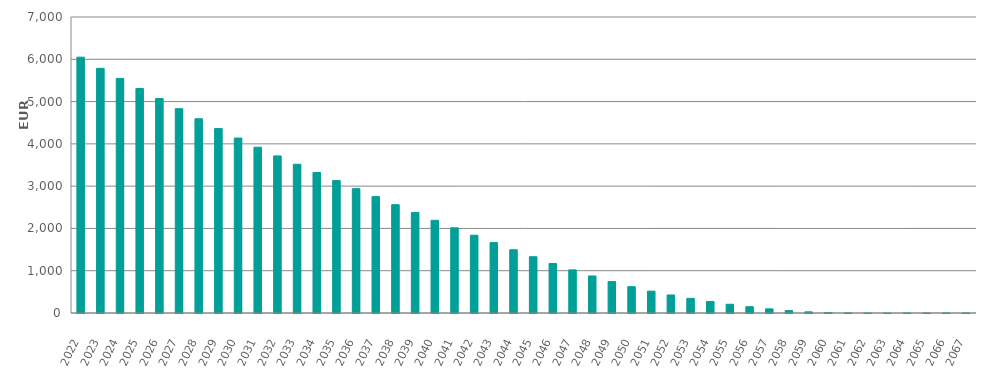
| Category | EUR Millions |
|---|---|
| 2022.0 | 6050000000.01 |
| 2023.0 | 5785903762.337 |
| 2024.0 | 5547004926.033 |
| 2025.0 | 5310112940.634 |
| 2026.0 | 5071433860.55 |
| 2027.0 | 4832241774.228 |
| 2028.0 | 4594077535.769 |
| 2029.0 | 4360960497.071 |
| 2030.0 | 4136912632.451 |
| 2031.0 | 3921872624.784 |
| 2032.0 | 3715298652.692 |
| 2033.0 | 3516658806.598 |
| 2034.0 | 3322507610.87 |
| 2035.0 | 3131002201.407 |
| 2036.0 | 2940967532.146 |
| 2037.0 | 2752085095.942 |
| 2038.0 | 2562058056.91 |
| 2039.0 | 2375397639.134 |
| 2040.0 | 2192349143.287 |
| 2041.0 | 2014003188.246 |
| 2042.0 | 1839297081.522 |
| 2043.0 | 1665497561.586 |
| 2044.0 | 1495465274.368 |
| 2045.0 | 1330691858.11 |
| 2046.0 | 1171359634.557 |
| 2047.0 | 1019510942.103 |
| 2048.0 | 875883843.72 |
| 2049.0 | 743000963.676 |
| 2050.0 | 622470632.605 |
| 2051.0 | 516904483.096 |
| 2052.0 | 426689296.667 |
| 2053.0 | 345878603.679 |
| 2054.0 | 272544310.551 |
| 2055.0 | 206654146.074 |
| 2056.0 | 148192586.917 |
| 2057.0 | 97653106.001 |
| 2058.0 | 56640776.07 |
| 2059.0 | 27048168.423 |
| 2060.0 | 9250638.219 |
| 2061.0 | 1425515.08 |
| 2062.0 | 90818.781 |
| 2063.0 | 33518.901 |
| 2064.0 | 15173.186 |
| 2065.0 | 3873.389 |
| 2066.0 | 1582.66 |
| 2067.0 | 0 |